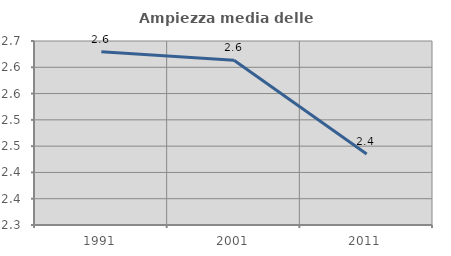
| Category | Ampiezza media delle famiglie |
|---|---|
| 1991.0 | 2.629 |
| 2001.0 | 2.613 |
| 2011.0 | 2.435 |